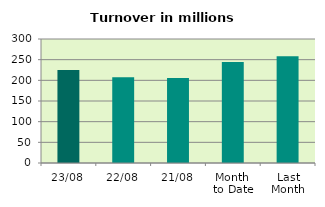
| Category | Series 0 |
|---|---|
| 23/08 | 225.204 |
| 22/08 | 207.742 |
| 21/08 | 205.791 |
| Month 
to Date | 244.147 |
| Last
Month | 258.125 |